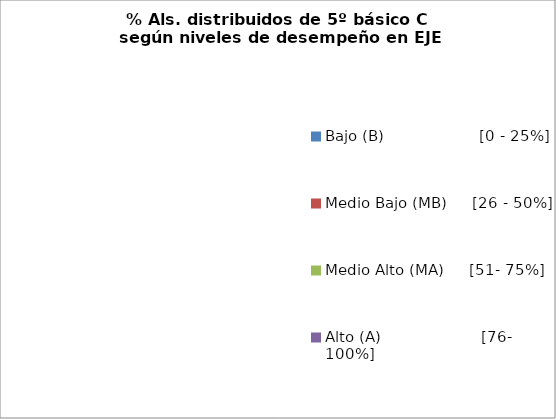
| Category | Series 0 |
|---|---|
| Bajo (B)                   [0 - 25%] | 0 |
| Medio Bajo (MB)     [26 - 50%] | 0 |
| Medio Alto (MA)     [51- 75%] | 0 |
| Alto (A)                    [76- 100%] | 0 |